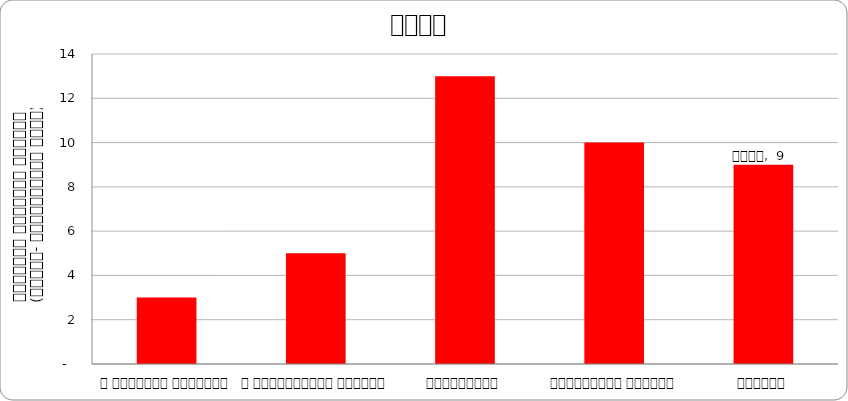
| Category | समाज |
|---|---|
| द हिमालयन टाइम्स् | 3 |
| द काठमाण्डौं पोस्ट् | 5 |
| कान्तिपुर | 13 |
| अन्नपूर्ण पोस्ट् | 10 |
| नागरिक | 9 |